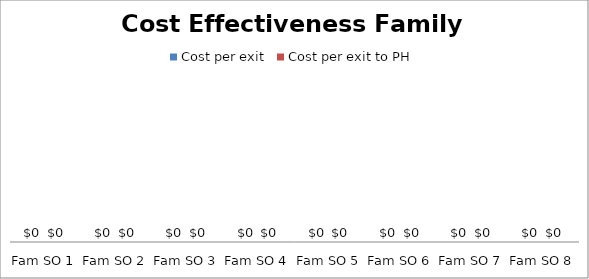
| Category | Cost per exit | Cost per exit to PH |
|---|---|---|
| Fam SO 1 | 0 | 0 |
| Fam SO 2 | 0 | 0 |
| Fam SO 3 | 0 | 0 |
| Fam SO 4 | 0 | 0 |
| Fam SO 5 | 0 | 0 |
| Fam SO 6 | 0 | 0 |
| Fam SO 7 | 0 | 0 |
| Fam SO 8 | 0 | 0 |